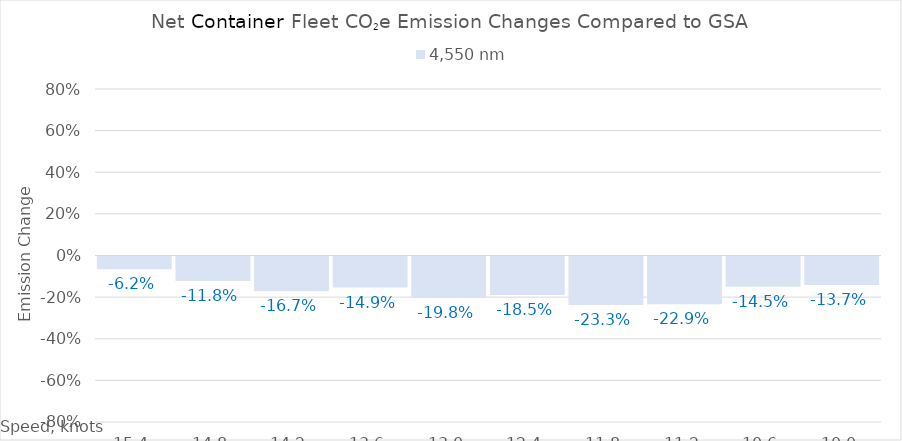
| Category | 4,550 |
|---|---|
| 15.4 | -0.062 |
| 14.8 | -0.118 |
| 14.200000000000001 | -0.167 |
| 13.600000000000001 | -0.149 |
| 13.000000000000002 | -0.198 |
| 12.400000000000002 | -0.185 |
| 11.800000000000002 | -0.233 |
| 11.200000000000003 | -0.229 |
| 10.600000000000003 | -0.145 |
| 10.000000000000004 | -0.137 |